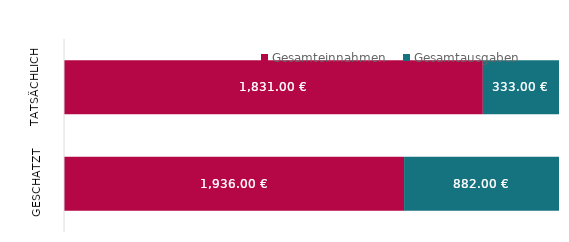
| Category | Gesamteinnahmen | Gesamtausgaben |
|---|---|---|
| Geschätzt | 1936 | 882 |
| Tatsächlich | 1831 | 333 |